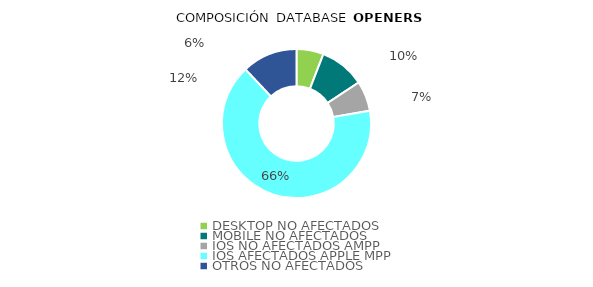
| Category | OPENERS |
|---|---|
| DESKTOP NO AFECTADOS | 26058 |
| MOBILE NO AFECTADOS | 43560 |
| IOS NO AFECTADOS AMPP | 28950 |
| IOS AFECTADOS APPLE MPP | 291176 |
| OTROS NO AFECTADOS | 53231 |